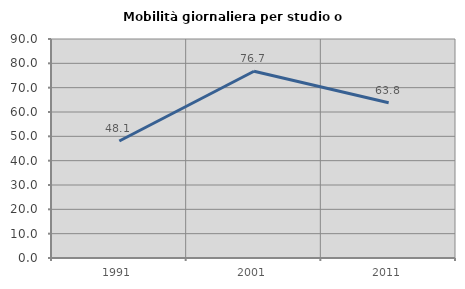
| Category | Mobilità giornaliera per studio o lavoro |
|---|---|
| 1991.0 | 48.089 |
| 2001.0 | 76.744 |
| 2011.0 | 63.793 |